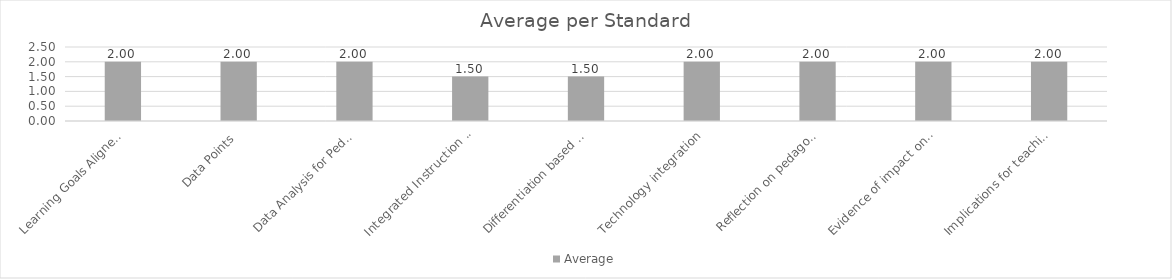
| Category | Average |
|---|---|
| Learning Goals Aligned with Pre-/Post-assessments ACEI 4.0 | 2 |
| Data Points | 2 |
| Data Analysis for Pedagogical Decisions ACEI 4.0 | 2 |
| Integrated Instruction ACEI 3.1 | 1.5 |
| Differentiation based on knowledge of individual learning ACEI 3.2 | 1.5 |
| Technology integration | 2 |
| Reflection on pedagogical decisions ACEI 1.0 | 2 |
| Evidence of impact on student learning ACEI 5.1 | 2 |
| Implications for teaching and professional development ACEI 5.1 | 2 |